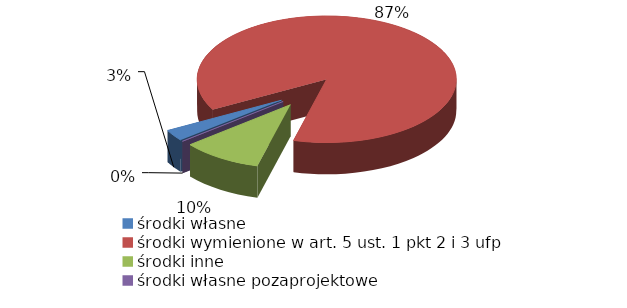
| Category | Series 0 |
|---|---|
| środki własne | 389061.61 |
| środki wymienione w art. 5 ust. 1 pkt 2 i 3 ufp | 11707749.08 |
| środki inne | 1345072.71 |
| środki własne pozaprojektowe | 7521.43 |